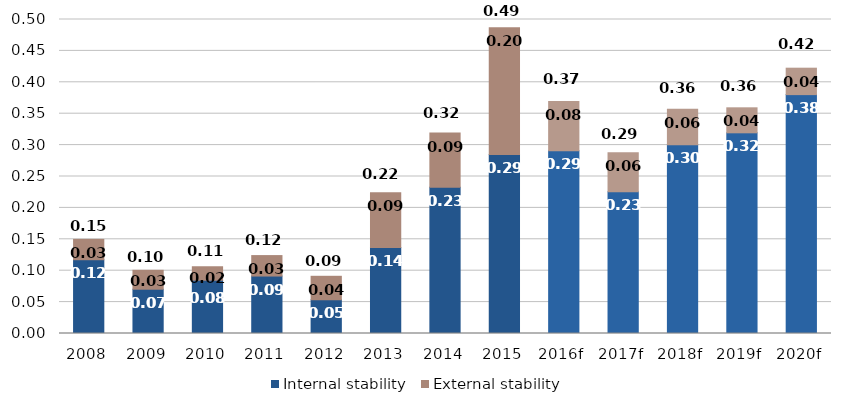
| Category | Internal stability | External stability |
|---|---|---|
| 2008 | 0.117 | 0.032 |
| 2009 | 0.071 | 0.03 |
| 2010 | 0.085 | 0.022 |
| 2011 | 0.091 | 0.033 |
| 2012 | 0.054 | 0.037 |
| 2013 | 0.137 | 0.087 |
| 2014 | 0.233 | 0.086 |
| 2015 | 0.285 | 0.202 |
| 2016f | 0.291 | 0.078 |
| 2017f | 0.226 | 0.062 |
| 2018f | 0.301 | 0.056 |
| 2019f | 0.32 | 0.04 |
| 2020f | 0.38 | 0.042 |